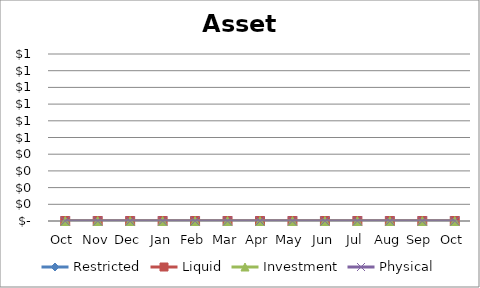
| Category | Restricted | Liquid | Investment | Physical |
|---|---|---|---|---|
| Oct | 0 | 0 | 0 | 0 |
| Nov | 0 | 0 | 0 | 0 |
| Dec | 0 | 0 | 0 | 0 |
| Jan | 0 | 0 | 0 | 0 |
| Feb | 0 | 0 | 0 | 0 |
| Mar | 0 | 0 | 0 | 0 |
| Apr | 0 | 0 | 0 | 0 |
| May | 0 | 0 | 0 | 0 |
| Jun | 0 | 0 | 0 | 0 |
| Jul | 0 | 0 | 0 | 0 |
| Aug | 0 | 0 | 0 | 0 |
| Sep | 0 | 0 | 0 | 0 |
| Oct | 0 | 0 | 0 | 0 |